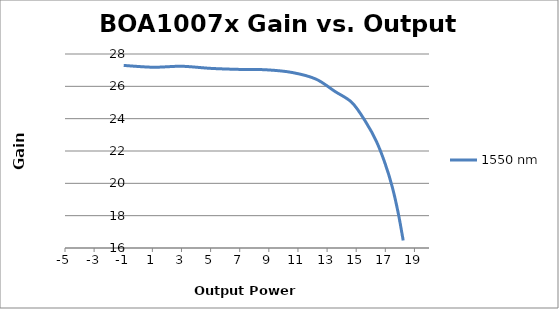
| Category | 1550 nm |
|---|---|
| -0.969 | 27.293 |
| 1.059 | 27.181 |
| 3.016 | 27.241 |
| 4.981 | 27.112 |
| 6.901 | 27.049 |
| 8.798 | 27.024 |
| 10.584 | 26.859 |
| 12.231 | 26.449 |
| 13.541 | 25.684 |
| 14.705 | 24.999 |
| 15.642 | 23.819 |
| 16.39 | 22.59 |
| 16.996 | 21.196 |
| 17.489 | 19.736 |
| 17.894 | 18.125 |
| 18.228 | 16.466 |